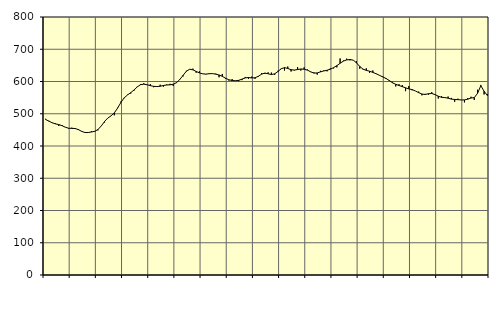
| Category | Piggar | Series 1 |
|---|---|---|
| nan | 484.3 | 482.21 |
| 87.0 | 478.1 | 477 |
| 87.0 | 471.3 | 471.91 |
| 87.0 | 470.2 | 468.63 |
| nan | 462.1 | 466.55 |
| 88.0 | 465.1 | 463.04 |
| 88.0 | 458 | 458.35 |
| 88.0 | 453.9 | 455.1 |
| nan | 456.8 | 454.6 |
| 89.0 | 455.7 | 454.3 |
| 89.0 | 452.7 | 450.87 |
| 89.0 | 444.4 | 445.42 |
| nan | 440.9 | 441.78 |
| 90.0 | 442.4 | 441.8 |
| 90.0 | 445.5 | 443.42 |
| 90.0 | 444.5 | 445.49 |
| nan | 448.5 | 451.05 |
| 91.0 | 462.4 | 462.18 |
| 91.0 | 473 | 475.91 |
| 91.0 | 486.8 | 486.66 |
| nan | 493.2 | 493.52 |
| 92.0 | 495.2 | 502.69 |
| 92.0 | 518.6 | 517.6 |
| 92.0 | 538 | 535.07 |
| nan | 548.4 | 549.22 |
| 93.0 | 559 | 558.13 |
| 93.0 | 562.6 | 565.29 |
| 93.0 | 571.8 | 573.62 |
| nan | 584.2 | 583.26 |
| 94.0 | 592 | 590.13 |
| 94.0 | 594.1 | 591.77 |
| 94.0 | 589.4 | 589.97 |
| nan | 591.7 | 587.15 |
| 95.0 | 582.3 | 585 |
| 95.0 | 584.1 | 584.28 |
| 95.0 | 590 | 585.3 |
| nan | 584.1 | 587.66 |
| 96.0 | 590.7 | 589.14 |
| 96.0 | 592.8 | 589.65 |
| 96.0 | 586.2 | 591.55 |
| nan | 597.4 | 596.36 |
| 97.0 | 605 | 606.16 |
| 97.0 | 615.8 | 619.02 |
| 97.0 | 633.2 | 631.64 |
| nan | 638.4 | 638.04 |
| 98.0 | 639.8 | 636.21 |
| 98.0 | 627.3 | 631.21 |
| 98.0 | 631.7 | 626.67 |
| nan | 623.3 | 623.71 |
| 99.0 | 622.2 | 622.95 |
| 99.0 | 625.4 | 624.21 |
| 99.0 | 623.8 | 624.46 |
| nan | 624.3 | 622.75 |
| 0.0 | 613.1 | 620.24 |
| 0.0 | 623.4 | 615.93 |
| 0.0 | 608.1 | 610.12 |
| nan | 603.1 | 605.36 |
| 1.0 | 607.3 | 603.04 |
| 1.0 | 601.8 | 602.38 |
| 1.0 | 600.8 | 603.6 |
| nan | 604.2 | 607.31 |
| 2.0 | 614.1 | 611.13 |
| 2.0 | 608.2 | 612.34 |
| 2.0 | 615.1 | 611.04 |
| nan | 608.4 | 611.57 |
| 3.0 | 614.5 | 616.06 |
| 3.0 | 626.3 | 622.74 |
| 3.0 | 623.5 | 626.14 |
| nan | 628.2 | 623.94 |
| 4.0 | 627.6 | 621.59 |
| 4.0 | 620.5 | 623.83 |
| 4.0 | 633.2 | 631.03 |
| nan | 640.3 | 639.47 |
| 5.0 | 634.1 | 643.1 |
| 5.0 | 646.3 | 640.41 |
| 5.0 | 631 | 636.49 |
| nan | 634.3 | 635.44 |
| 6.0 | 644.8 | 637.04 |
| 6.0 | 634.1 | 638.79 |
| 6.0 | 643.6 | 638.07 |
| nan | 637.1 | 635.23 |
| 7.0 | 629.3 | 630.08 |
| 7.0 | 628.1 | 625.97 |
| 7.0 | 621.3 | 626.61 |
| nan | 633.1 | 629.83 |
| 8.0 | 634.2 | 632.7 |
| 8.0 | 631.5 | 634.87 |
| 8.0 | 640.5 | 638.15 |
| nan | 640.7 | 642.96 |
| 9.0 | 643.8 | 649.15 |
| 9.0 | 671.4 | 656.53 |
| 9.0 | 664.8 | 663.24 |
| nan | 670.8 | 666.87 |
| 10.0 | 665.4 | 668.26 |
| 10.0 | 666.6 | 666.19 |
| 10.0 | 663.3 | 657.97 |
| nan | 639.7 | 646.7 |
| 11.0 | 637.2 | 638.36 |
| 11.0 | 640.8 | 634.42 |
| 11.0 | 626.9 | 631.9 |
| nan | 634.2 | 628.26 |
| 12.0 | 623.2 | 623.99 |
| 12.0 | 618.5 | 619.32 |
| 12.0 | 615.8 | 614.27 |
| nan | 610.9 | 609.64 |
| 13.0 | 601.7 | 603.2 |
| 13.0 | 598.6 | 596.06 |
| 13.0 | 584.8 | 591.28 |
| nan | 591.5 | 587.64 |
| 14.0 | 588.9 | 584.14 |
| 14.0 | 570.1 | 580.29 |
| 14.0 | 585.9 | 577.1 |
| nan | 572.8 | 574.86 |
| 15.0 | 570.7 | 570.73 |
| 15.0 | 568.7 | 565.41 |
| 15.0 | 557.1 | 561.19 |
| nan | 561.6 | 559.75 |
| 16.0 | 559.3 | 562.04 |
| 16.0 | 566.9 | 562.83 |
| 16.0 | 558.7 | 559.46 |
| nan | 547.3 | 554.39 |
| 17.0 | 554.5 | 551.01 |
| 17.0 | 549.4 | 550.13 |
| 17.0 | 553.3 | 548.3 |
| nan | 549.1 | 545.41 |
| 18.0 | 536.9 | 544.27 |
| 18.0 | 546.8 | 543.75 |
| 18.0 | 542.6 | 542.78 |
| nan | 535.2 | 542.91 |
| 19.0 | 548.5 | 545.08 |
| 19.0 | 552.6 | 548.92 |
| 19.0 | 542.7 | 549.93 |
| nan | 574.4 | 563.33 |
| 20.0 | 589.4 | 587.16 |
| 20.0 | 559.8 | 569.84 |
| 20.0 | 561.1 | 556.71 |